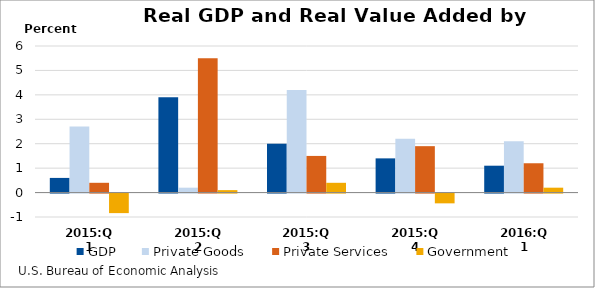
| Category | GDP | Private Goods | Private Services | Government |
|---|---|---|---|---|
| 2015:Q1 | 0.6 | 2.7 | 0.4 | -0.8 |
| 2015:Q2 | 3.9 | 0.2 | 5.5 | 0.1 |
| 2015:Q3 | 2 | 4.2 | 1.5 | 0.4 |
| 2015:Q4 | 1.4 | 2.2 | 1.9 | -0.4 |
| 2016:Q1 | 1.1 | 2.1 | 1.2 | 0.2 |